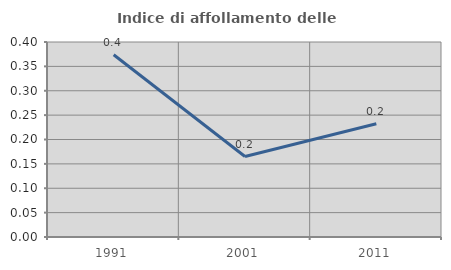
| Category | Indice di affollamento delle abitazioni  |
|---|---|
| 1991.0 | 0.374 |
| 2001.0 | 0.165 |
| 2011.0 | 0.232 |